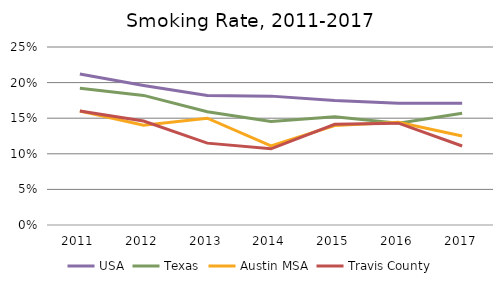
| Category | USA | Texas | Austin MSA | Travis County |
|---|---|---|---|---|
| 2011.0 | 0.212 | 0.192 | 0.16 | 0.16 |
| 2012.0 | 0.196 | 0.182 | 0.14 | 0.146 |
| 2013.0 | 0.182 | 0.159 | 0.15 | 0.115 |
| 2014.0 | 0.181 | 0.145 | 0.111 | 0.107 |
| 2015.0 | 0.175 | 0.152 | 0.14 | 0.141 |
| 2016.0 | 0.171 | 0.143 | 0.144 | 0.143 |
| 2017.0 | 0.171 | 0.157 | 0.125 | 0.111 |